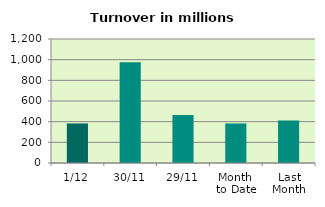
| Category | Series 0 |
|---|---|
| 1/12 | 382.696 |
| 30/11 | 974.069 |
| 29/11 | 463.759 |
| Month 
to Date | 382.696 |
| Last
Month | 410.338 |